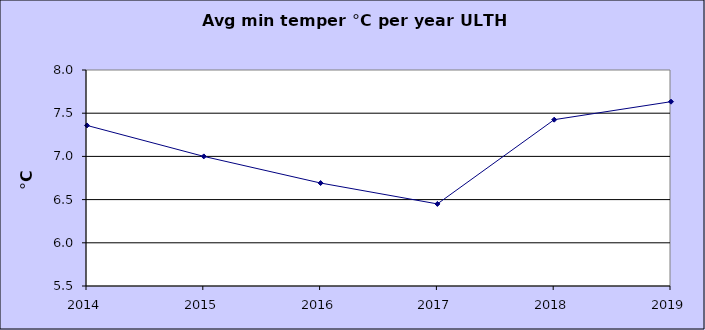
| Category | Series 0 |
|---|---|
| 2014.0 | 7.358 |
| 2015.0 | 7 |
| 2016.0 | 6.692 |
| 2017.0 | 6.45 |
| 2018.0 | 7.425 |
| 2019.0 | 7.633 |